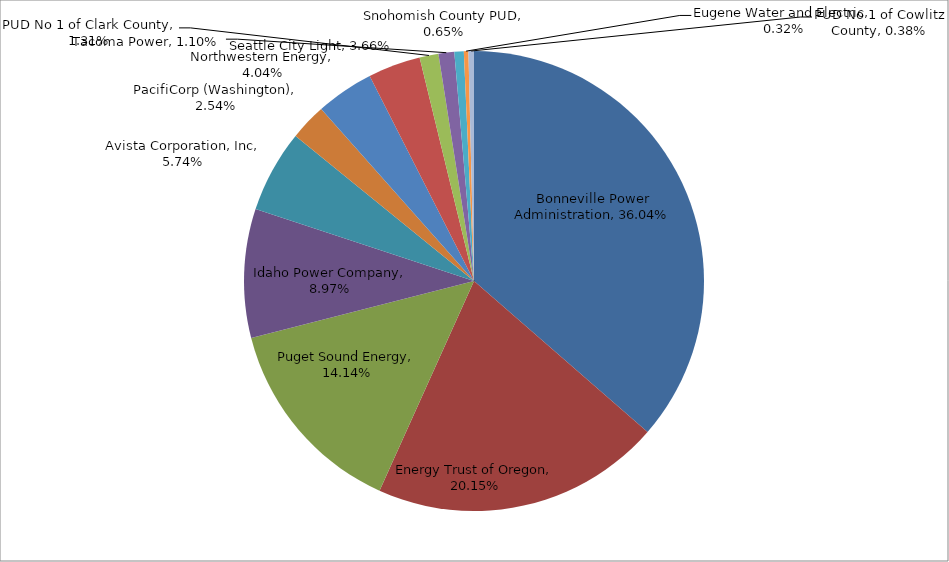
| Category | Series 0 |
|---|---|
| Bonneville Power Administration | 0.36 |
| Energy Trust of Oregon | 0.201 |
| Puget Sound Energy | 0.141 |
| Idaho Power Company | 0.09 |
| Avista Corporation, Inc | 0.057 |
| PacifiCorp (Washington) | 0.025 |
| Northwestern Energy | 0.04 |
| Seattle City Light | 0.037 |
| PUD No 1 of Clark County | 0.013 |
| Tacoma Power | 0.011 |
| Snohomish County PUD | 0.007 |
| Eugene Water and Electric | 0.003 |
| PUD No 1 of Cowlitz County | 0.004 |